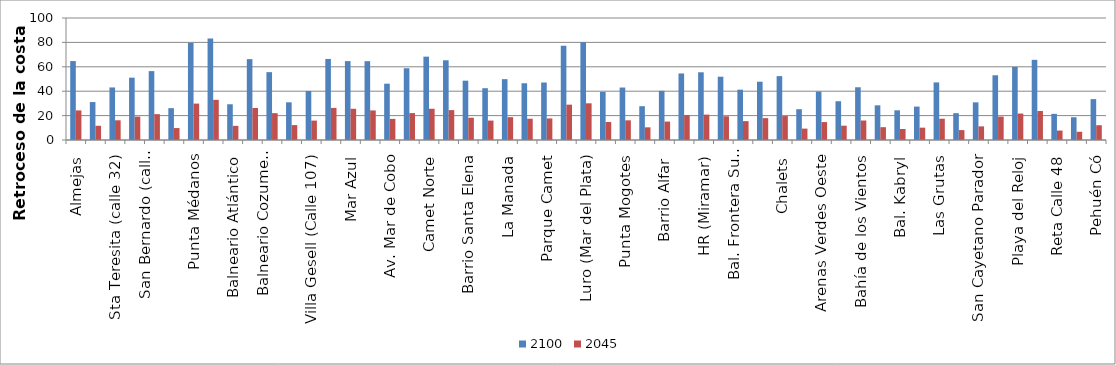
| Category | 2100 | 2045 |
|---|---|---|
| Almejas | 64.686 | 24.257 |
| Las Toninas | 31.101 | 11.663 |
| Sta Teresita (calle 32) | 43.073 | 16.152 |
| Mar del Tuyú (calle 58) | 51.101 | 19.163 |
| San Bernardo (calle Andrade) | 56.469 | 21.176 |
| Mar de Ajó | 26.1 | 9.787 |
| Punta Médanos | 79.592 | 29.847 |
| Pinamar Golf Club | 83.197 | 32.932 |
| Balneario Atlántico | 29.295 | 11.596 |
| La Pérgola (Valeria del Mar) | 66.283 | 26.237 |
| Balneario Cozumel (Cariló) | 55.608 | 22.012 |
| Villa Gesell (Calle 309) | 30.888 | 12.227 |
| Villa Gesell (Calle 107) | 40.195 | 15.91 |
| Balneario Soleado (Mar de las Pampas) | 66.424 | 26.293 |
| Mar Azul | 64.658 | 25.594 |
| Calle San Martín | 64.607 | 24.228 |
| Av. Mar de Cobo | 46.155 | 17.308 |
| Av. Del Parque (La Caleta) | 58.822 | 22.058 |
| Camet Norte | 68.313 | 25.617 |
| Santa Clara del Mar | 65.348 | 24.506 |
| Barrio Santa Elena | 48.631 | 18.236 |
| Playa Los Cantiles | 42.454 | 15.92 |
| La Manada | 49.873 | 18.702 |
| La Cloaca (Mar del Plata) | 46.506 | 17.44 |
| Parque Camet | 47.127 | 17.673 |
| Strobel (Mar del Plata) | 77.248 | 28.968 |
| Luro (Mar del Plata) | 80.21 | 30.079 |
| Playa Grande (Mar del Plata) | 39.409 | 14.778 |
| Punta Mogotes | 43.01 | 16.129 |
| Honu Beach | 27.712 | 10.392 |
| Barrio Alfar | 40.308 | 15.115 |
| Chapadmalal | 54.547 | 20.455 |
| HR (Miramar) | 55.501 | 20.813 |
| Monolito (Miramar) | 51.891 | 19.459 |
| Bal. Frontera Sur (Miramar) | 41.256 | 15.471 |
| Bal. Cocoloco | 47.772 | 17.915 |
| Chalets | 52.355 | 19.633 |
| Centinela del Mar | 25.245 | 9.33 |
| Arenas Verdes Oeste | 39.732 | 14.683 |
| Costa Bonita | 31.781 | 11.745 |
| Bahía de los Vientos | 43.23 | 15.976 |
| Av. 75 Necochea | 28.417 | 10.502 |
| Bal. Kabryl | 24.339 | 8.995 |
| Médano Blanco | 27.382 | 10.12 |
| Las Grutas | 47.201 | 17.444 |
| Bal. Los Angeles | 21.988 | 8.126 |
| San Cayetano Parador | 30.862 | 11.163 |
| Orense | 53.059 | 19.191 |
| Playa del Reloj | 59.94 | 21.68 |
| Bal. Barlovento (Dunamar) | 65.706 | 23.766 |
| Reta Calle 48 | 21.443 | 7.756 |
| Faro Recalada | 18.646 | 6.744 |
| Pehuén Có | 33.51 | 12.121 |